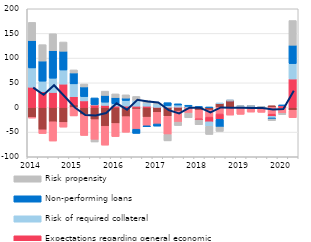
| Category | Costs of funding | Competition from other banks | Expectations regarding general economic situation | Risk of required collateral  | Non-performing loans  | Risk propensity |
|---|---|---|---|---|---|---|
| 2014.0 | -19.9 | -1.7 | 41 | 39.1 | 55.5 | 36.9 |
| nan | -45.3 | -7.7 | 31.9 | 21.4 | 40.8 | 33.2 |
| nan | -29 | -39.1 | 30.4 | 28.9 | 55.7 | 34.4 |
| nan | -30.3 | -9.6 | 47.3 | 28.6 | 38.1 | 18.7 |
| 2015.0 | 5.3 | -17.2 | 16.4 | 26.1 | 22.1 | 6.2 |
| nan | -14.5 | -42.3 | 13.3 | 8.7 | 19.6 | 6 |
| nan | -24.7 | -41.2 | 5.2 | 0.6 | 13.5 | -4.1 |
| nan | -38.1 | -38.3 | 4.2 | 6.5 | 13.7 | 8.7 |
| 2016.0 | -32.5 | -26.6 | 2.8 | 4.8 | 12.6 | 7.3 |
| nan | -18.6 | -31.7 | 2.8 | 11.4 | 4.8 | 6.6 |
| nan | -3.2 | -40.9 | 2.6 | 11.7 | -8.5 | 8 |
| nan | -19.7 | -17.5 | 2.6 | 6.4 | -2 | 5.6 |
| 2017.0 | -9.9 | -23.6 | 0.3 | 6.6 | -4.3 | 1.9 |
| nan | -17.9 | -37.2 | 0.4 | 3.4 | 5.9 | -12.7 |
| nan | -7.4 | -22.4 | 0.6 | 4.3 | 2.5 | -6.8 |
| nan | -2.2 | -9.3 | 0.1 | 2.2 | 2.2 | -9.5 |
| 2018.0 | -5.5 | -17.5 | -2.5 | 0 | 1.9 | -9.6 |
| nan | -5.2 | -14.4 | -9.5 | -9.1 | 0.3 | -16.5 |
| nan | 8.2 | -13.3 | -10.8 | 0.3 | -15.6 | -8.9 |
| nan | 13.5 | -15.5 | 0.1 | 0.3 | 0.3 | 0.1 |
| 2019.0 | 0 | -14 | 0.1 | 2.4 | 0.3 | 0.1 |
| nan | 2.3 | -9.4 | 0.1 | 0.3 | 0.3 | 0.1 |
| nan | 0 | -9.9 | 0.1 | 0.4 | 0.4 | 0.1 |
| nan | 3.5 | -13.7 | -4.4 | -3.2 | -2.2 | -3.4 |
| 2020.0 | 0 | -11.883 | 3.724 | 0.378 | 0.378 | -2.584 |
| nan | -5.65 | -15.101 | 57.663 | 31.218 | 37.319 | 50.006 |